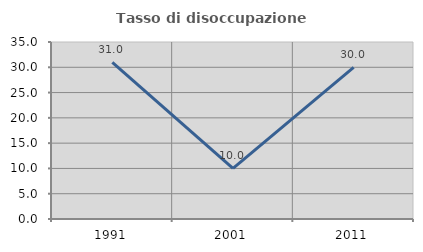
| Category | Tasso di disoccupazione giovanile  |
|---|---|
| 1991.0 | 30.973 |
| 2001.0 | 10 |
| 2011.0 | 30 |